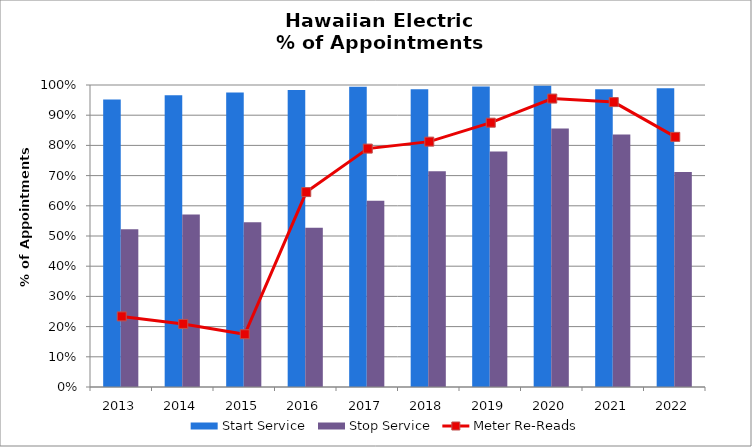
| Category | Start Service | Stop Service |
|---|---|---|
| 2013.0 | 0.952 | 0.522 |
| 2014.0 | 0.966 | 0.571 |
| 2015.0 | 0.976 | 0.546 |
| 2016.0 | 0.984 | 0.527 |
| 2017.0 | 0.994 | 0.617 |
| 2018.0 | 0.986 | 0.715 |
| 2019.0 | 0.995 | 0.78 |
| 2020.0 | 0.997 | 0.856 |
| 2021.0 | 0.986 | 0.836 |
| 2022.0 | 0.989 | 0.712 |